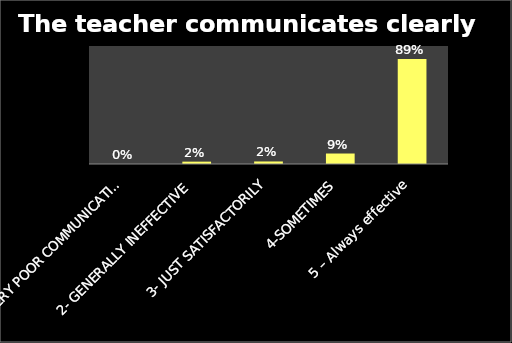
| Category | Series 0 |
|---|---|
| 1- VERY POOR COMMUNICATION | 0 |
| 2- GENERALLY INEFFECTIVE | 0.02 |
| 3- JUST SATISFACTORILY | 0.021 |
| 4-SOMETIMES | 0.089 |
| 5 – Always effective | 0.89 |